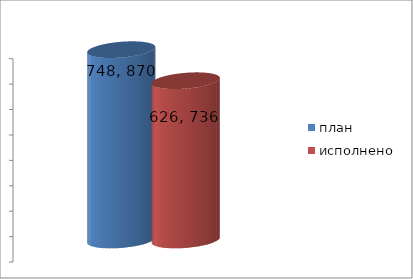
| Category | план | исполнено |
|---|---|---|
| 0 | 748870616.53 | 626736014.4 |